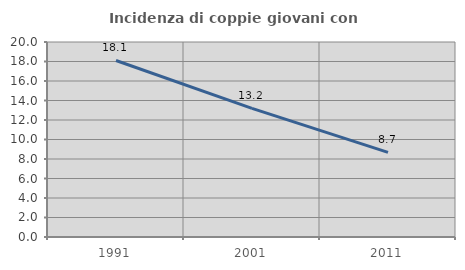
| Category | Incidenza di coppie giovani con figli |
|---|---|
| 1991.0 | 18.103 |
| 2001.0 | 13.191 |
| 2011.0 | 8.679 |